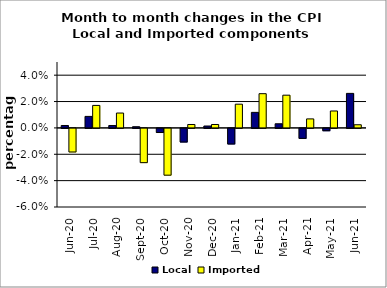
| Category | Local | Imported |
|---|---|---|
| 2020-06-01 | 0.002 | -0.018 |
| 2020-07-01 | 0.009 | 0.017 |
| 2020-08-01 | 0.002 | 0.011 |
| 2020-09-01 | 0.001 | -0.026 |
| 2020-10-01 | -0.003 | -0.035 |
| 2020-11-01 | -0.01 | 0.003 |
| 2020-12-01 | 0.001 | 0.003 |
| 2021-01-01 | -0.012 | 0.018 |
| 2021-02-01 | 0.012 | 0.026 |
| 2021-03-01 | 0.003 | 0.025 |
| 2021-04-01 | -0.008 | 0.007 |
| 2021-05-01 | -0.002 | 0.013 |
| 2021-06-01 | 0.026 | 0.002 |